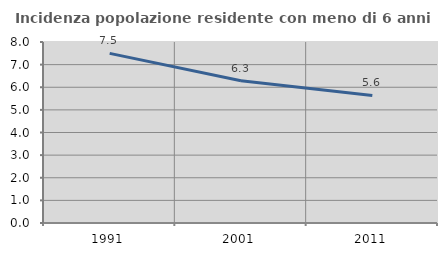
| Category | Incidenza popolazione residente con meno di 6 anni |
|---|---|
| 1991.0 | 7.498 |
| 2001.0 | 6.286 |
| 2011.0 | 5.637 |